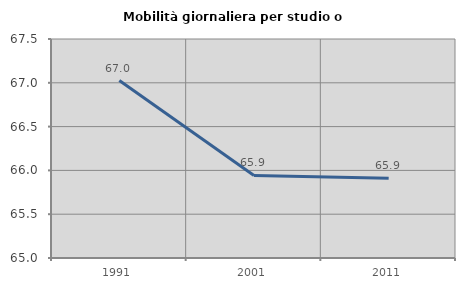
| Category | Mobilità giornaliera per studio o lavoro |
|---|---|
| 1991.0 | 67.025 |
| 2001.0 | 65.943 |
| 2011.0 | 65.911 |